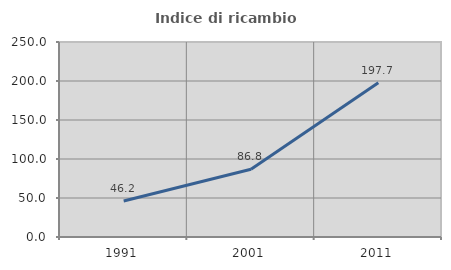
| Category | Indice di ricambio occupazionale  |
|---|---|
| 1991.0 | 46.214 |
| 2001.0 | 86.802 |
| 2011.0 | 197.65 |